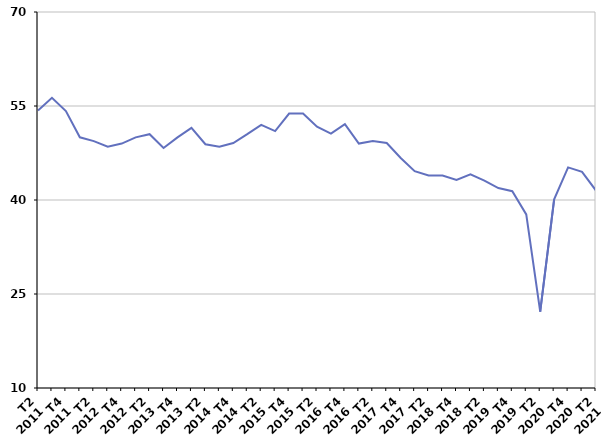
| Category | Autre cas |
|---|---|
| T2
2011 | 54.3 |
| T3
2011 | 56.3 |
| T4
2011 | 54.2 |
| T1
2012 | 50 |
| T2
2012 | 49.4 |
| T3
2012 | 48.5 |
| T4
2012 | 49 |
| T1
2013 | 50 |
| T2
2013 | 50.5 |
| T3
2013 | 48.3 |
| T4
2013 | 50 |
| T1
2014 | 51.5 |
| T2
2014 | 48.9 |
| T3
2014 | 48.5 |
| T4
2014 | 49.1 |
| T1
2015 | 50.5 |
| T2
2015 | 52 |
| T3
2015 | 51 |
| T4
2015 | 53.8 |
| T1
2016 | 53.8 |
| T2
2016 | 51.7 |
| T3
2016 | 50.6 |
| T4
2016 | 52.1 |
| T1
2017 | 49 |
| T2
2017 | 49.4 |
| T3
2017 | 49.1 |
| T4
2017 | 46.7 |
| T1
2018 | 44.6 |
| T2
2018 | 43.9 |
| T3
2018 | 43.9 |
| T4
2018 | 43.2 |
| T1
2019 | 44.1 |
| T2
2019 | 43.1 |
| T3
2019 | 41.9 |
| T4
2019 | 41.4 |
| T1
2020 | 37.7 |
| T2
2020 | 22.2 |
| T3
2020 | 40.1 |
| T4
2020 | 45.2 |
| T1
2021 | 44.5 |
| T2
2021 | 41.5 |